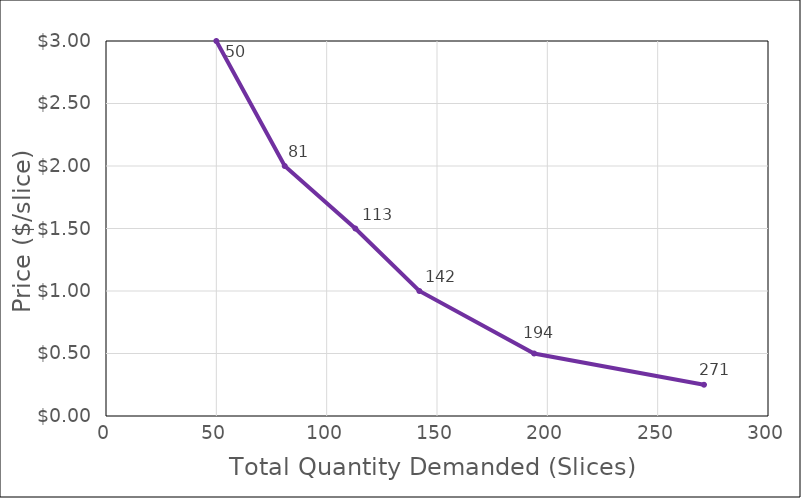
| Category | Pizza DD|PBJ-$2 |
|---|---|
| 50.0 | 3 |
| 81.0 | 2 |
| 113.0 | 1.5 |
| 142.0 | 1 |
| 194.0 | 0.5 |
| 271.0 | 0.25 |